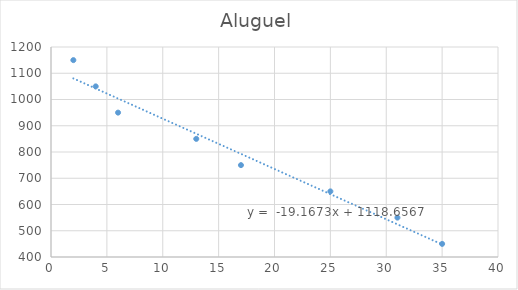
| Category | Aluguel |
|---|---|
| 35.0 | 450 |
| 31.0 | 550 |
| 25.0 | 650 |
| 17.0 | 750 |
| 13.0 | 850 |
| 6.0 | 950 |
| 4.0 | 1050 |
| 2.0 | 1150 |